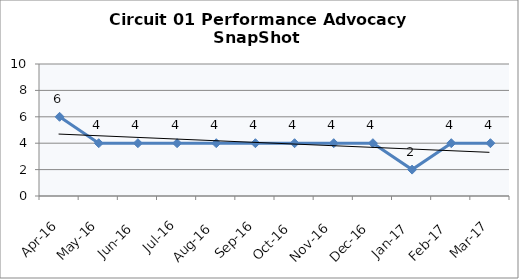
| Category | Circuit 01 |
|---|---|
| Apr-16 | 6 |
| May-16 | 4 |
| Jun-16 | 4 |
| Jul-16 | 4 |
| Aug-16 | 4 |
| Sep-16 | 4 |
| Oct-16 | 4 |
| Nov-16 | 4 |
| Dec-16 | 4 |
| Jan-17 | 2 |
| Feb-17 | 4 |
| Mar-17 | 4 |